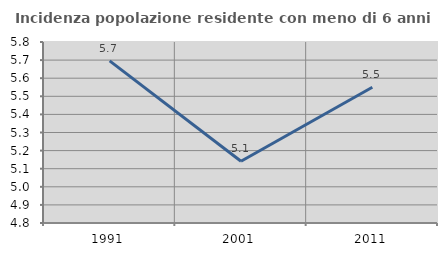
| Category | Incidenza popolazione residente con meno di 6 anni |
|---|---|
| 1991.0 | 5.696 |
| 2001.0 | 5.142 |
| 2011.0 | 5.55 |